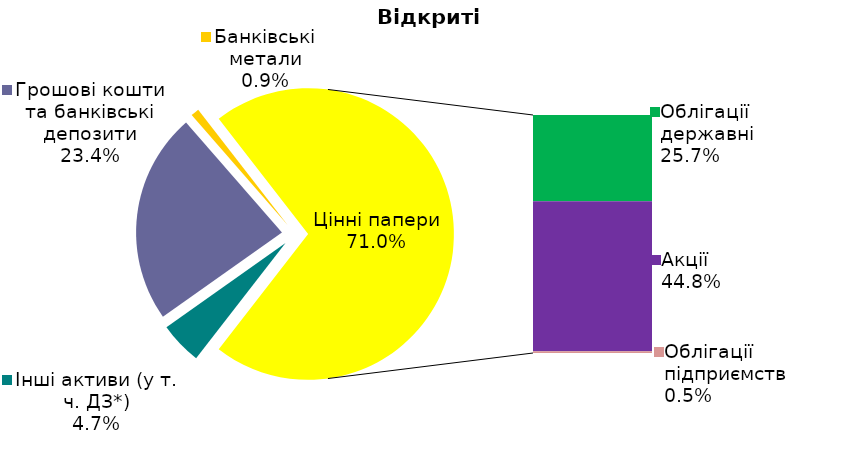
| Category | Series 0 |
|---|---|
| Інші активи (у т. ч. ДЗ*) | 0.047 |
| Грошові кошти та банківські депозити | 0.234 |
| Банківські метали | 0.009 |
| Облігації державні  | 0.257 |
| Акції | 0.448 |
| Облігації підприємств | 0.005 |